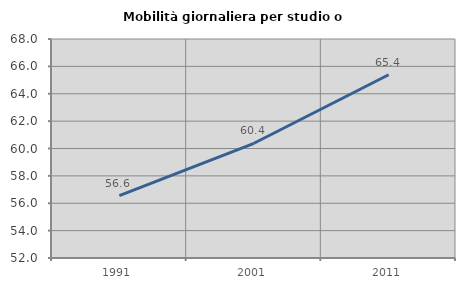
| Category | Mobilità giornaliera per studio o lavoro |
|---|---|
| 1991.0 | 56.556 |
| 2001.0 | 60.381 |
| 2011.0 | 65.391 |